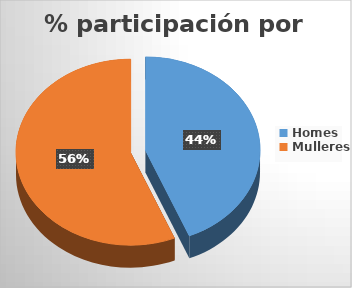
| Category | Series 0 |
|---|---|
| Homes | 796 |
| Mulleres | 1024 |